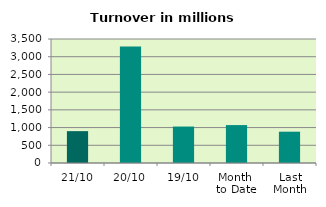
| Category | Series 0 |
|---|---|
| 21/10 | 899.311 |
| 20/10 | 3285.78 |
| 19/10 | 1029.012 |
| Month 
to Date | 1070.362 |
| Last
Month | 883.598 |